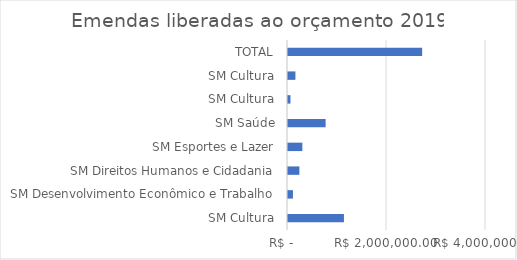
| Category | Series 0 |
|---|---|
| SM Cultura | 1130000 |
| SM Desenvolvimento Econômico e Trabalho | 100000 |
| SM Direitos Humanos e Cidadania | 230000 |
| SM Esportes e Lazer | 290000 |
| SM Saúde | 760000 |
| SM Cultura | 50000 |
| SM Cultura | 150000 |
| TOTAL | 2710000 |